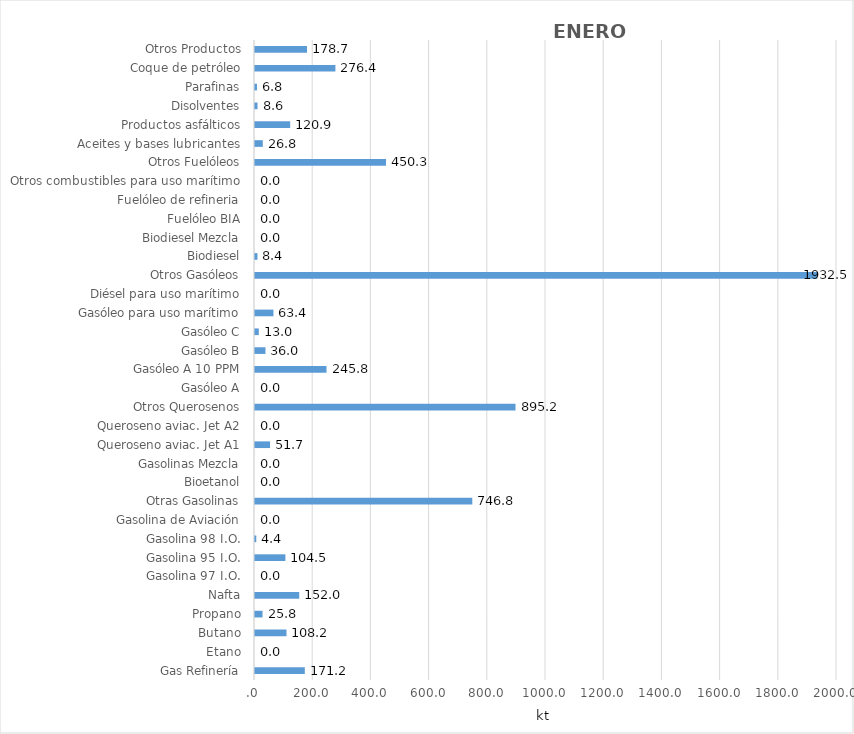
| Category | Series 0 |
|---|---|
| Gas Refinería | 171.174 |
| Etano | 0 |
| Butano | 108.219 |
| Propano | 25.814 |
| Nafta | 151.985 |
| Gasolina 97 I.O. | 0 |
| Gasolina 95 I.O. | 104.451 |
| Gasolina 98 I.O. | 4.369 |
| Gasolina de Aviación | 0 |
| Otras Gasolinas | 746.775 |
| Bioetanol | 0 |
| Gasolinas Mezcla | 0 |
| Queroseno aviac. Jet A1 | 51.723 |
| Queroseno aviac. Jet A2 | 0 |
| Otros Querosenos | 895.241 |
| Gasóleo A | 0 |
| Gasóleo A 10 PPM | 245.779 |
| Gasóleo B | 35.983 |
| Gasóleo C | 13.041 |
| Gasóleo para uso marítimo | 63.41 |
| Diésel para uso marítimo | 0 |
| Otros Gasóleos | 1932.47 |
| Biodiesel | 8.411 |
| Biodiesel Mezcla | 0 |
| Fuelóleo BIA | 0 |
| Fuelóleo de refineria | 0 |
| Otros combustibles para uso marítimo | 0 |
| Otros Fuelóleos | 450.274 |
| Aceites y bases lubricantes | 26.797 |
| Productos asfálticos | 120.872 |
| Disolventes | 8.643 |
| Parafinas | 6.776 |
| Coque de petróleo | 276.361 |
| Otros Productos | 178.729 |